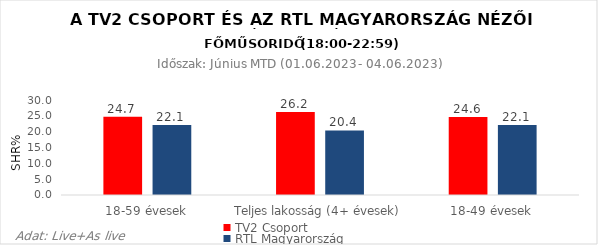
| Category | TV2 Csoport | RTL Magyarország |
|---|---|---|
| 18-59 évesek | 24.7 | 22.1 |
| Teljes lakosság (4+ évesek) | 26.2 | 20.4 |
| 18-49 évesek | 24.6 | 22.1 |